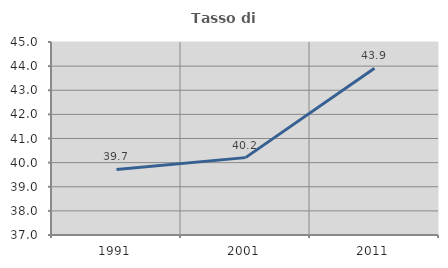
| Category | Tasso di occupazione   |
|---|---|
| 1991.0 | 39.715 |
| 2001.0 | 40.207 |
| 2011.0 | 43.91 |